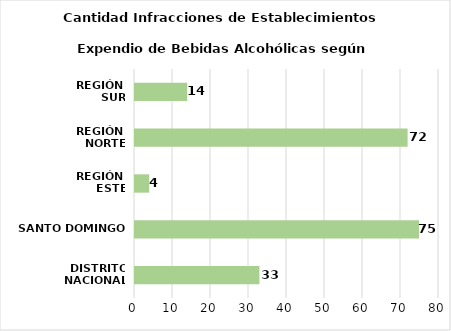
| Category | Series 0 |
|---|---|
| DISTRITO NACIONAL | 33 |
| SANTO DOMINGO | 75 |
| REGIÓN 
ESTE | 4 |
| REGIÓN 
NORTE | 72 |
| REGIÓN 
SUR | 14 |